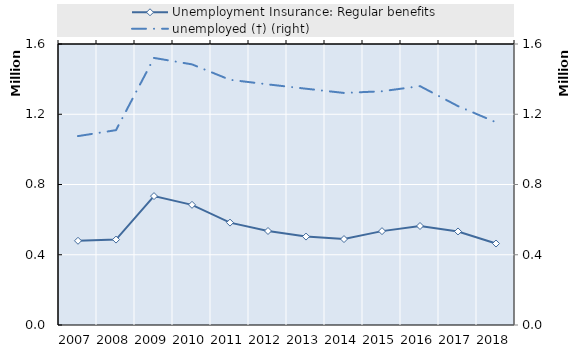
| Category | Survivors' pension from occupational accident insurance | 0 | Series 14 | Series 15 | Series 16 | Series 17 | Series 18 | Series 19 | Unemployment Insurance: Regular benefits |
|---|---|---|---|---|---|---|---|---|---|
| 2007.0 |  |  |  |  |  |  |  |  | 479469 |
| 2008.0 |  |  |  |  |  |  |  |  | 486326 |
| 2009.0 |  |  |  |  |  |  |  |  | 733984 |
| 2010.0 |  |  |  |  |  |  |  |  | 684179 |
| 2011.0 |  |  |  |  |  |  |  |  | 582985 |
| 2012.0 |  |  |  |  |  |  |  |  | 535250 |
| 2013.0 |  |  |  |  |  |  |  |  | 503435 |
| 2014.0 |  |  |  |  |  |  |  |  | 489295 |
| 2015.0 |  |  |  |  |  |  |  |  | 534518 |
| 2016.0 |  |  |  |  |  |  |  |  | 563704 |
| 2017.0 |  |  |  |  |  |  |  |  | 532600.833 |
| 2018.0 |  |  |  |  |  |  |  |  | 463910 |